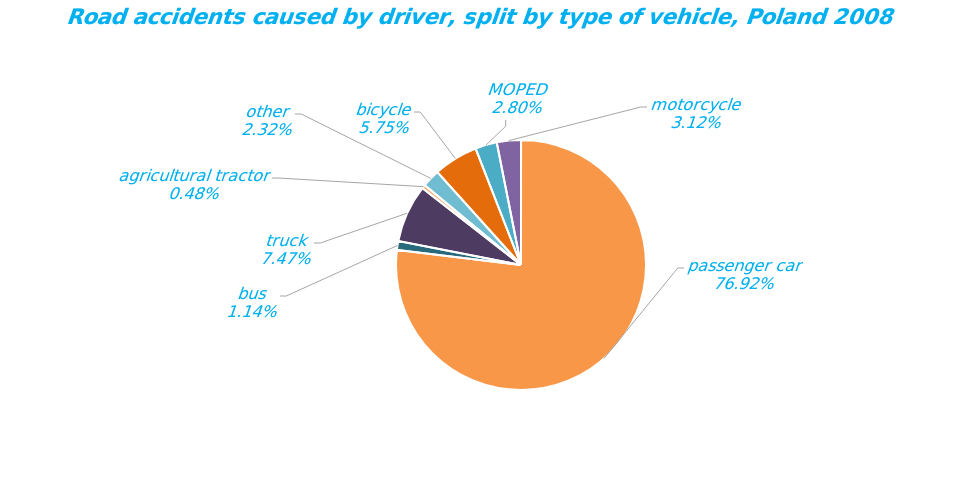
| Category | Series 0 |
|---|---|
| bicycle | 2205 |
| MOPED | 1073 |
| motorcycle | 1195 |
| passenger car | 29475 |
| bus | 436 |
| truck | 2864 |
| agricultural tractor | 182 |
| other | 888 |